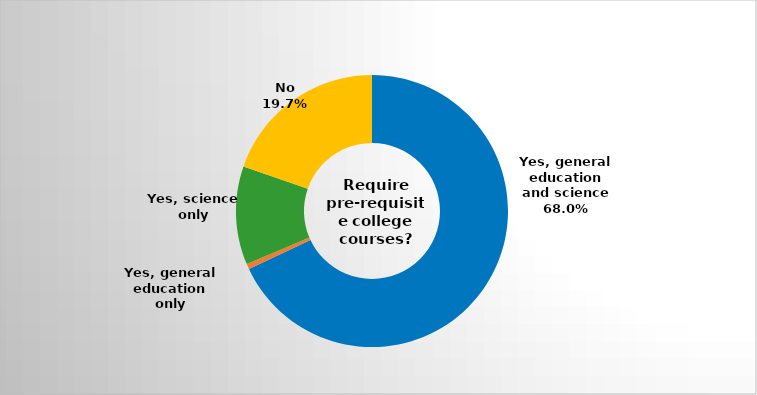
| Category | Series 0 |
|---|---|
| Yes, general education and science | 0.68 |
| Yes, general education only | 0.006 |
| Yes, science only | 0.117 |
| No | 0.197 |